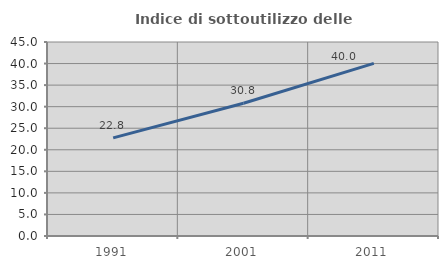
| Category | Indice di sottoutilizzo delle abitazioni  |
|---|---|
| 1991.0 | 22.756 |
| 2001.0 | 30.803 |
| 2011.0 | 40.04 |